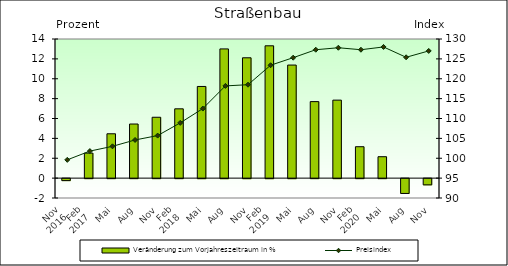
| Category | Veränderung zum Vorjahreszeitraum in % |
|---|---|
| 0 | -0.2 |
| 1 | 2.518 |
| 2 | 4.462 |
| 3 | 5.444 |
| 4 | 6.124 |
| 5 | 6.974 |
| 6 | 9.223 |
| 7 | 13.002 |
| 8 | 12.11 |
| 9 | 13.315 |
| 10 | 11.378 |
| 11 | 7.699 |
| 12 | 7.848 |
| 13 | 3.16 |
| 14 | 2.155 |
| 15 | -1.493 |
| 16 | -0.626 |